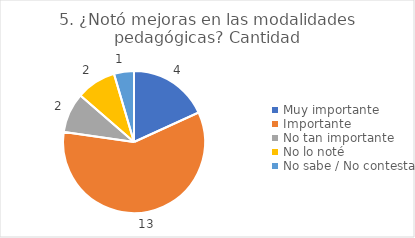
| Category | 5. ¿Notó mejoras en las modalidades pedagógicas? |
|---|---|
| Muy importante  | 0.182 |
| Importante  | 0.591 |
| No tan importante  | 0.091 |
| No lo noté  | 0.091 |
| No sabe / No contesta | 0.045 |